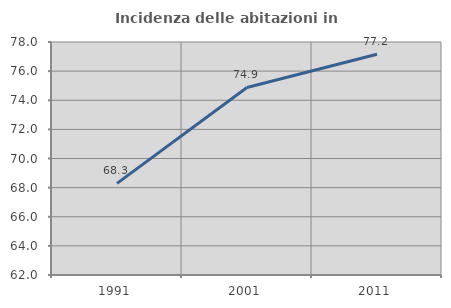
| Category | Incidenza delle abitazioni in proprietà  |
|---|---|
| 1991.0 | 68.29 |
| 2001.0 | 74.879 |
| 2011.0 | 77.157 |